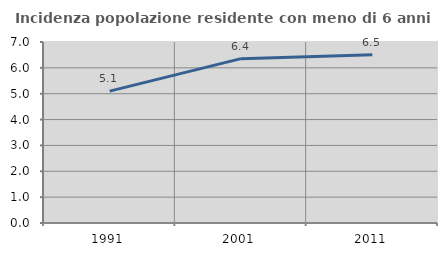
| Category | Incidenza popolazione residente con meno di 6 anni |
|---|---|
| 1991.0 | 5.101 |
| 2001.0 | 6.357 |
| 2011.0 | 6.507 |